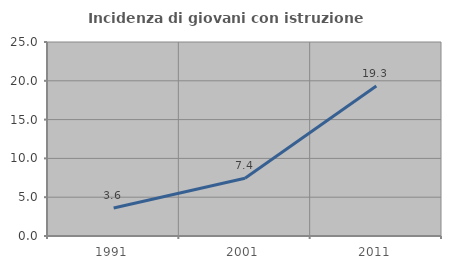
| Category | Incidenza di giovani con istruzione universitaria |
|---|---|
| 1991.0 | 3.604 |
| 2001.0 | 7.436 |
| 2011.0 | 19.336 |